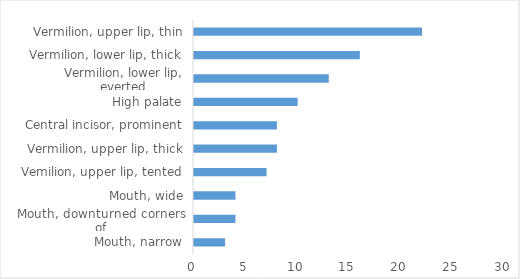
| Category | Series 0 |
|---|---|
| Mouth, narrow | 3 |
| Mouth, downturned corners of | 4 |
| Mouth, wide | 4 |
| Vemilion, upper lip, tented | 7 |
| Vermilion, upper lip, thick | 8 |
| Central incisor, prominent | 8 |
| High palate | 10 |
| Vermilion, lower lip, everted | 13 |
| Vermilion, lower lip, thick | 16 |
| Vermilion, upper lip, thin | 22 |